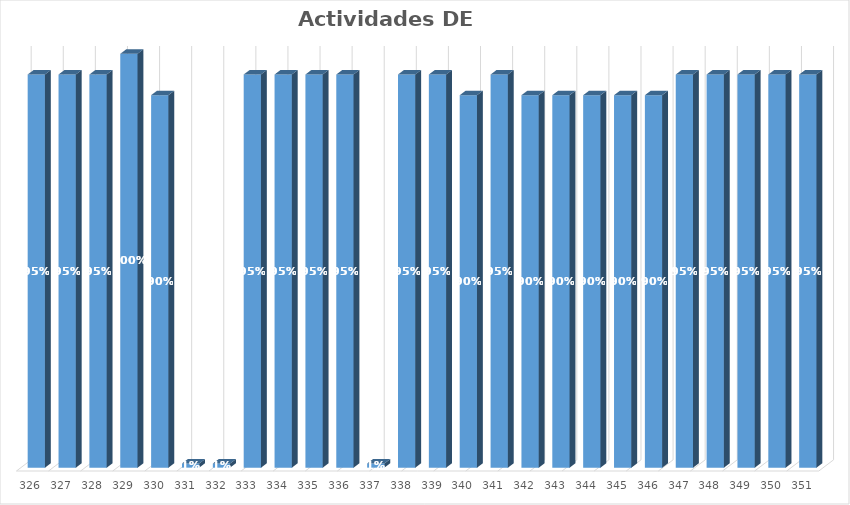
| Category | % Avance |
|---|---|
| 326.0 | 0.95 |
| 327.0 | 0.95 |
| 328.0 | 0.95 |
| 329.0 | 1 |
| 330.0 | 0.9 |
| 331.0 | 0.01 |
| 332.0 | 0.01 |
| 333.0 | 0.95 |
| 334.0 | 0.95 |
| 335.0 | 0.95 |
| 336.0 | 0.95 |
| 337.0 | 0.01 |
| 338.0 | 0.95 |
| 339.0 | 0.95 |
| 340.0 | 0.9 |
| 341.0 | 0.95 |
| 342.0 | 0.9 |
| 343.0 | 0.9 |
| 344.0 | 0.9 |
| 345.0 | 0.9 |
| 346.0 | 0.9 |
| 347.0 | 0.95 |
| 348.0 | 0.95 |
| 349.0 | 0.95 |
| 350.0 | 0.95 |
| 351.0 | 0.95 |